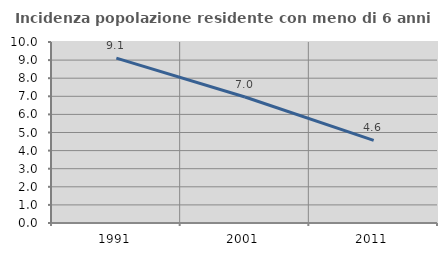
| Category | Incidenza popolazione residente con meno di 6 anni |
|---|---|
| 1991.0 | 9.108 |
| 2001.0 | 6.962 |
| 2011.0 | 4.563 |